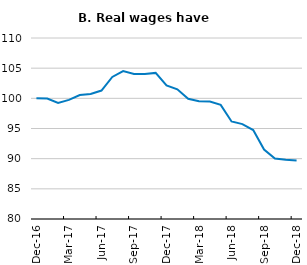
| Category | Real wages |
|---|---|
| Dec-16 | 100 |
| Jan-17 | 99.962 |
| Feb-17 | 99.232 |
| Mar-17 | 99.735 |
| Apr-17 | 100.556 |
| May-17 | 100.718 |
| Jun-17 | 101.289 |
| Jul-17 | 103.54 |
| Aug-17 | 104.51 |
| Sep-17 | 104.02 |
| Oct-17 | 104.024 |
| Nov-17 | 104.213 |
| Dec-17 | 102.146 |
| Jan-18 | 101.493 |
| Feb-18 | 99.926 |
| Mar-18 | 99.504 |
| Apr-18 | 99.462 |
| May-18 | 98.917 |
| Jun-18 | 96.167 |
| Jul-18 | 95.724 |
| Aug-18 | 94.743 |
| Sep-18 | 91.517 |
| Oct-18 | 90.008 |
| Nov-18 | 89.807 |
| Dec-18 | 89.706 |